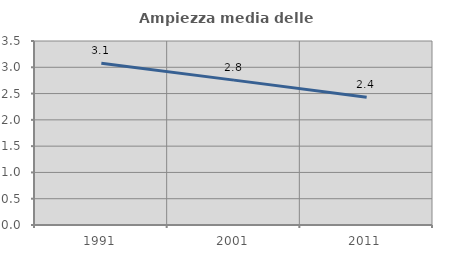
| Category | Ampiezza media delle famiglie |
|---|---|
| 1991.0 | 3.077 |
| 2001.0 | 2.756 |
| 2011.0 | 2.429 |